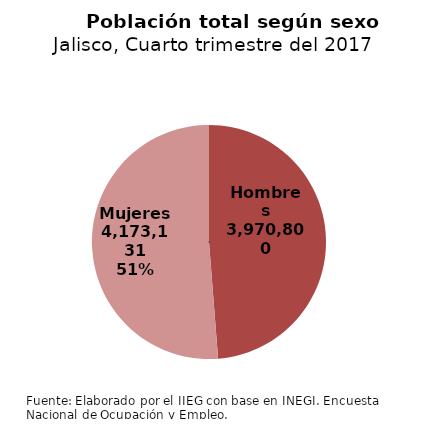
| Category | Series 0 |
|---|---|
| Hombres | 3970800 |
| Mujeres | 4173131 |